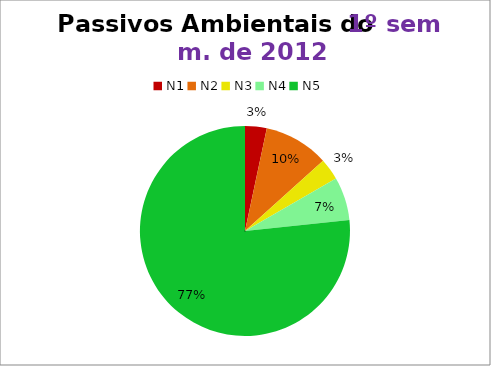
| Category | 1º/12 |
|---|---|
| N1 | 1 |
| N2 | 3 |
| N3 | 1 |
| N4 | 2 |
| N5 | 23 |